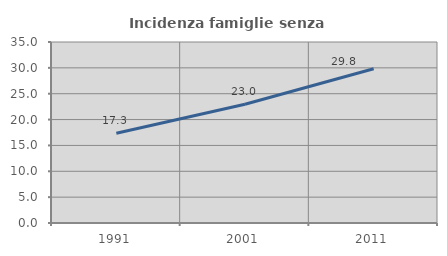
| Category | Incidenza famiglie senza nuclei |
|---|---|
| 1991.0 | 17.342 |
| 2001.0 | 22.976 |
| 2011.0 | 29.819 |